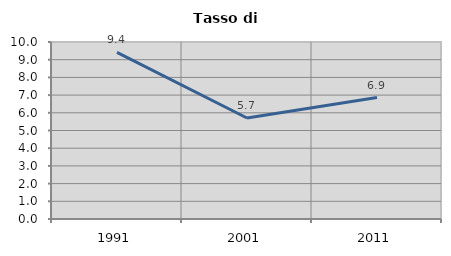
| Category | Tasso di disoccupazione   |
|---|---|
| 1991.0 | 9.416 |
| 2001.0 | 5.706 |
| 2011.0 | 6.863 |